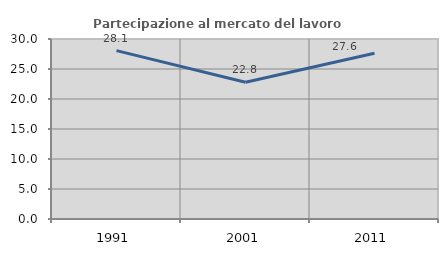
| Category | Partecipazione al mercato del lavoro  femminile |
|---|---|
| 1991.0 | 28.061 |
| 2001.0 | 22.805 |
| 2011.0 | 27.629 |